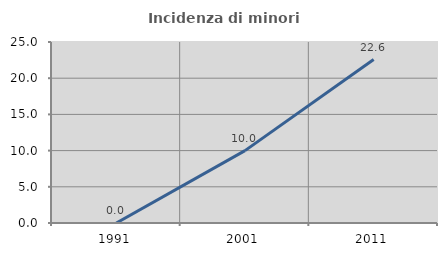
| Category | Incidenza di minori stranieri |
|---|---|
| 1991.0 | 0 |
| 2001.0 | 10 |
| 2011.0 | 22.581 |